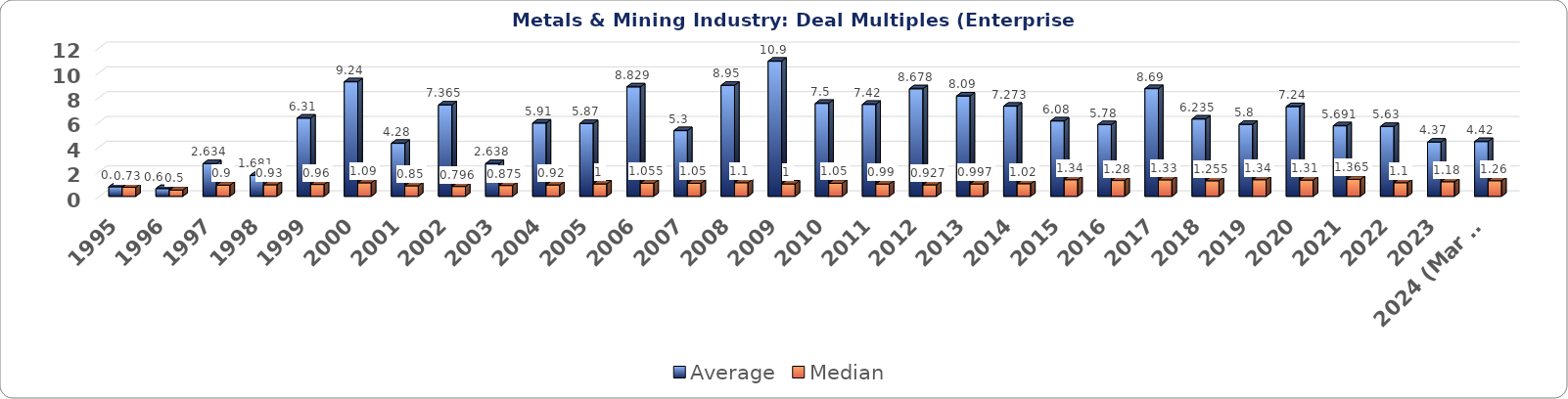
| Category | Average | Median |
|---|---|---|
| 1995 | 0.77 | 0.73 |
| 1996 | 0.627 | 0.5 |
| 1997 | 2.634 | 0.9 |
| 1998 | 1.681 | 0.93 |
| 1999 | 6.31 | 0.96 |
| 2000 | 9.24 | 1.09 |
| 2001 | 4.276 | 0.85 |
| 2002 | 7.365 | 0.796 |
| 2003 | 2.638 | 0.875 |
| 2004 | 5.91 | 0.92 |
| 2005 | 5.87 | 1 |
| 2006 | 8.829 | 1.055 |
| 2007 | 5.3 | 1.05 |
| 2008 | 8.95 | 1.1 |
| 2009 | 10.9 | 1 |
| 2010 | 7.5 | 1.05 |
| 2011 | 7.42 | 0.99 |
| 2012 | 8.678 | 0.927 |
| 2013 | 8.09 | 0.997 |
| 2014 | 7.273 | 1.02 |
| 2015 | 6.08 | 1.34 |
| 2016 | 5.78 | 1.28 |
| 2017 | 8.69 | 1.33 |
| 2018 | 6.235 | 1.255 |
| 2019 | 5.8 | 1.34 |
| 2020 | 7.24 | 1.31 |
| 2021 | 5.691 | 1.365 |
| 2022 | 5.63 | 1.1 |
| 2023 | 4.37 | 1.18 |
| 2024 (Mar 31) | 4.42 | 1.26 |